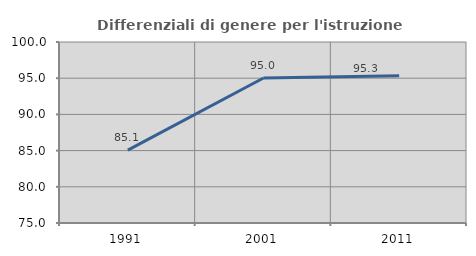
| Category | Differenziali di genere per l'istruzione superiore |
|---|---|
| 1991.0 | 85.068 |
| 2001.0 | 95.024 |
| 2011.0 | 95.344 |